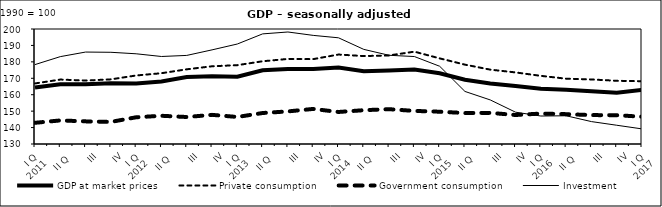
| Category | GDP at market prices | Private consumption | Government consumption | Investment |
|---|---|---|---|---|
| I Q 
2011 | 164.361 | 166.853 | 142.905 | 178.343 |
| II Q  | 166.376 | 169.223 | 144.342 | 183.179 |
| III | 166.392 | 168.626 | 143.777 | 185.966 |
| IV | 166.932 | 169.352 | 143.451 | 185.827 |
| I Q 
2012 | 166.876 | 171.703 | 146.265 | 184.912 |
| II Q  | 168.067 | 173.083 | 147.182 | 183.265 |
| III | 170.736 | 175.463 | 146.426 | 183.92 |
| IV | 171.184 | 177.309 | 147.738 | 187.298 |
| I Q 
2013 | 170.969 | 177.988 | 146.456 | 190.869 |
| II Q  | 174.894 | 180.367 | 148.861 | 197.032 |
| III | 175.668 | 181.774 | 149.842 | 198.182 |
| IV | 175.699 | 181.665 | 151.345 | 196.11 |
| I Q 
2014 | 176.502 | 184.453 | 149.49 | 194.643 |
| II Q  | 174.26 | 183.526 | 150.577 | 187.591 |
| III | 174.699 | 183.899 | 151.193 | 184 |
| IV | 175.283 | 186.204 | 150.14 | 183.239 |
| I Q 
2015 | 173.072 | 182.126 | 149.655 | 177.321 |
| II Q  | 169.135 | 178.309 | 148.841 | 161.992 |
| III | 166.838 | 175.269 | 148.946 | 156.824 |
| IV | 165.254 | 173.566 | 147.64 | 149.371 |
| I Q 
2016 | 163.589 | 171.486 | 148.523 | 147.027 |
| II Q  | 163.062 | 169.754 | 148.169 | 147.184 |
| III | 162.118 | 169.294 | 147.591 | 143.642 |
| IV | 161.229 | 168.477 | 147.531 | 141.415 |
| I Q 
2017 | 162.917 | 168.231 | 146.615 | 139.196 |